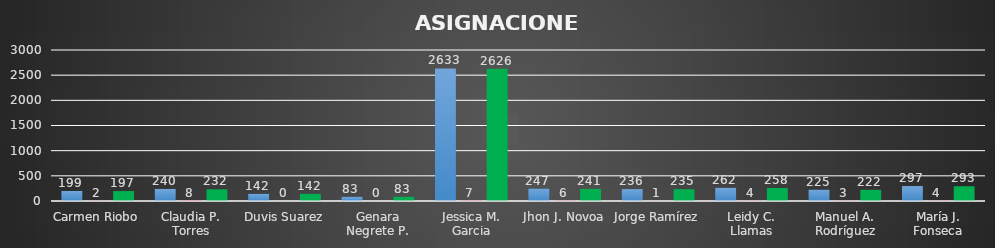
| Category | Series 0 | Series 1 | Series 2 |
|---|---|---|---|
| Carmen Riobo | 199 | 2 | 197 |
| Claudia P. Torres | 240 | 8 | 232 |
| Duvis Suarez | 142 | 0 | 142 |
| Genara Negrete P. | 83 | 0 | 83 |
| Jessica M. Garcia | 2633 | 7 | 2626 |
| Jhon J. Novoa | 247 | 6 | 241 |
| Jorge Ramírez | 236 | 1 | 235 |
| Leidy C. Llamas | 262 | 4 | 258 |
| Manuel A. Rodríguez | 225 | 3 | 222 |
| María J. Fonseca | 297 | 4 | 293 |